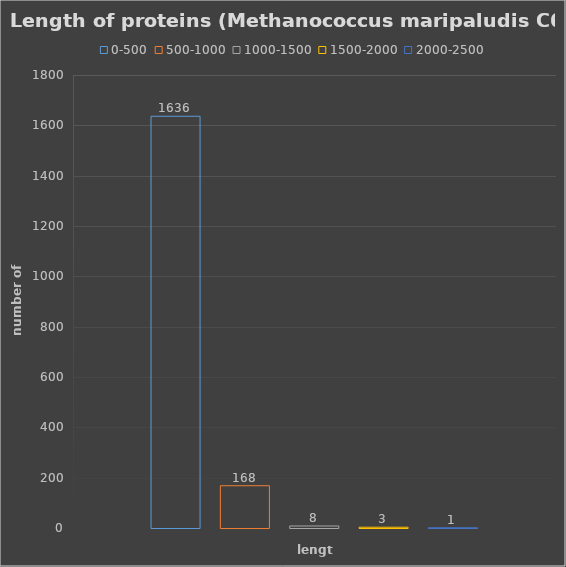
| Category | 0-500 | 500-1000 | 1000-1500 | 1500-2000 | 2000-2500 |
|---|---|---|---|---|---|
| 0 | 1636 | 168 | 8 | 3 | 1 |